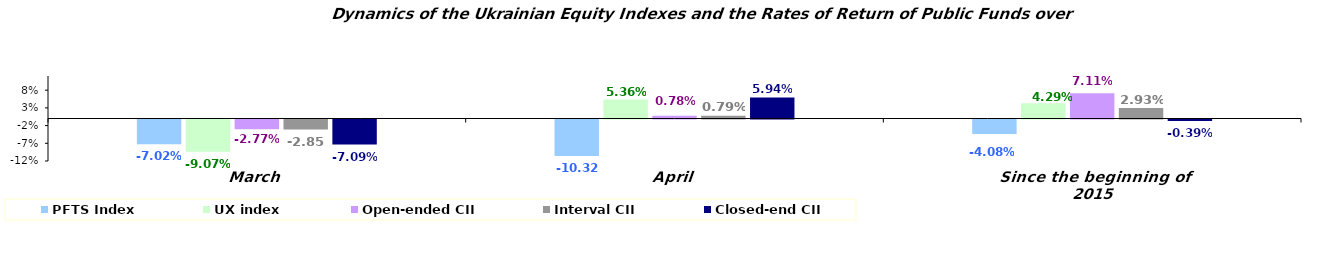
| Category | PFTS Index | UX index | Open-ended CII | Interval CII | Closed-end CII |
|---|---|---|---|---|---|
| March | -0.07 | -0.091 | -0.028 | -0.029 | -0.071 |
| April | -0.103 | 0.054 | 0.008 | 0.008 | 0.059 |
| Since the beginning of 2015 | -0.041 | 0.043 | 0.071 | 0.029 | -0.004 |